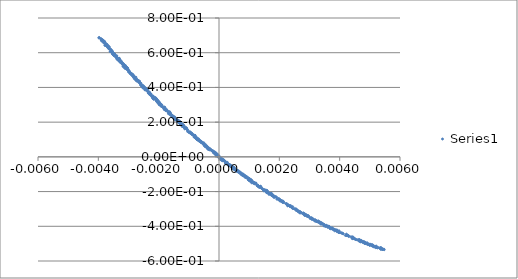
| Category | Series 0 |
|---|---|
| 0.0044368 | -0.464 |
| -0.0038042 | 0.659 |
| -0.0010522 | 0.158 |
| 0.00016845 | -0.019 |
| -0.0020957 | 0.334 |
| 0.00043947 | -0.056 |
| 0.00034397 | -0.047 |
| 0.001742 | -0.214 |
| -0.0013712 | 0.207 |
| 0.00099336 | -0.135 |
| 0.001655 | -0.216 |
| -0.002423 | 0.394 |
| 0.0010156 | -0.137 |
| -0.00056222 | 0.081 |
| -0.0010402 | 0.146 |
| 0.00020681 | -0.028 |
| 0.0010113 | -0.133 |
| -0.00313 | 0.514 |
| 0.002281 | -0.282 |
| -0.00067644 | 0.094 |
| 0.0052149 | -0.514 |
| 0.0021076 | -0.262 |
| -0.0015751 | 0.243 |
| -0.0030436 | 0.504 |
| 0.0029677 | -0.343 |
| 0.0050297 | -0.504 |
| 0.004289 | -0.453 |
| 0.0042575 | -0.454 |
| 0.0028009 | -0.328 |
| -0.00369 | 0.641 |
| -0.0012805 | 0.2 |
| 0.0015531 | -0.198 |
| -0.0015731 | 0.239 |
| 0.0023578 | -0.286 |
| 0.0006467 | -0.08 |
| 0.0017924 | -0.22 |
| 0.0022135 | -0.27 |
| 0.0036869 | -0.414 |
| 0.0019726 | -0.247 |
| -0.0036637 | 0.631 |
| -0.0019037 | 0.297 |
| 0.00087271 | -0.119 |
| -8.2279e-05 | 0.014 |
| 0.0049892 | -0.506 |
| -0.0022611 | 0.355 |
| -0.0028558 | 0.464 |
| -0.0018347 | 0.283 |
| 0.0013852 | -0.171 |
| -0.00028588 | 0.041 |
| 0.0024418 | -0.287 |
| 0.0036483 | -0.403 |
| -0.0011639 | 0.176 |
| -0.0028305 | 0.458 |
| 0.0050886 | -0.514 |
| -0.0025743 | 0.414 |
| 0.00478 | -0.488 |
| 0.0034057 | -0.384 |
| -0.0031957 | 0.535 |
| 0.0053647 | -0.529 |
| 0.001361 | -0.176 |
| -0.0010696 | 0.166 |
| 0.0028413 | -0.333 |
| -0.0029999 | 0.491 |
| -0.0037633 | 0.644 |
| 0.0022752 | -0.281 |
| 0.0034293 | -0.383 |
| 0.00056681 | -0.075 |
| 0.00033338 | -0.047 |
| 0.00021367 | -0.03 |
| -0.0011641 | 0.178 |
| -0.0034738 | 0.59 |
| 0.0039133 | -0.426 |
| -0.0013881 | 0.207 |
| 0.0027062 | -0.319 |
| 0.00093261 | -0.122 |
| 0.0048831 | -0.501 |
| 0.002695 | -0.322 |
| -0.00026158 | 0.041 |
| -0.0026672 | 0.439 |
| -0.00045644 | 0.062 |
| 0.0047831 | -0.495 |
| 0.00017566 | -0.025 |
| 0.0049978 | -0.503 |
| -0.0032841 | 0.546 |
| -0.0036489 | 0.622 |
| 0.0050599 | -0.511 |
| -0.0013146 | 0.195 |
| -0.0026327 | 0.431 |
| -0.00073186 | 0.101 |
| -0.003198 | 0.541 |
| -0.0016477 | 0.252 |
| -0.0016981 | 0.262 |
| -0.001611 | 0.247 |
| 0.0035788 | -0.399 |
| 0.003601 | -0.406 |
| 0.0020371 | -0.249 |
| 0.0054187 | -0.533 |
| -0.0035977 | 0.618 |
| 0.0051197 | -0.518 |
| -0.002965 | 0.493 |
| -0.0013525 | 0.203 |
| 0.0030805 | -0.361 |
| 4.7973e-05 | -0.007 |
| 0.0039146 | -0.423 |
| -0.00029224 | 0.046 |
| -0.0031313 | 0.524 |
| 0.0019871 | -0.243 |
| 0.0025629 | -0.309 |
| -0.0009814 | 0.142 |
| -0.0023002 | 0.367 |
| 0.00012115 | -0.018 |
| 0.00078824 | -0.108 |
| -0.0023041 | 0.371 |
| -0.0030424 | 0.513 |
| -0.0027268 | 0.444 |
| -0.001194 | 0.178 |
| -0.001812 | 0.272 |
| -0.0006367 | 0.09 |
| 0.00025769 | -0.033 |
| 0.00068978 | -0.092 |
| 0.0021221 | -0.255 |
| -0.00040166 | 0.062 |
| -0.0020535 | 0.327 |
| 0.00070861 | -0.094 |
| -0.0013437 | 0.206 |
| -0.0028089 | 0.464 |
| 0.00064698 | -0.087 |
| 0.0047986 | -0.493 |
| -0.0013027 | 0.203 |
| -0.00051239 | 0.074 |
| 0.0015804 | -0.193 |
| -0.0034625 | 0.583 |
| -0.00241 | 0.388 |
| 0.00069083 | -0.092 |
| 1.3595e-05 | -0.002 |
| 0.0014998 | -0.189 |
| 0.00038708 | -0.054 |
| 0.0053807 | -0.53 |
| 0.0017589 | -0.222 |
| -0.0013686 | 0.213 |
| 0.0029479 | -0.342 |
| 0.0031679 | -0.367 |
| -0.0019831 | 0.315 |
| 0.0047708 | -0.489 |
| -0.0022888 | 0.364 |
| -0.0023291 | 0.369 |
| 0.0010617 | -0.145 |
| 0.004632 | -0.477 |
| 0.00084273 | -0.113 |
| -0.0023525 | 0.374 |
| -0.00013238 | 0.027 |
| 0.0017718 | -0.222 |
| -0.0023196 | 0.365 |
| -0.0014854 | 0.224 |
| 0.0033862 | -0.387 |
| 0.0047202 | -0.486 |
| 0.0046787 | -0.486 |
| 0.001156 | -0.152 |
| -0.00044462 | 0.07 |
| -0.0007004 | 0.102 |
| 0.0039506 | -0.43 |
| 0.00098681 | -0.123 |
| -0.0016763 | 0.249 |
| 0.0010869 | -0.135 |
| 0.0046526 | -0.48 |
| 0.00096707 | -0.131 |
| -0.0027101 | 0.443 |
| -0.0034882 | 0.595 |
| 0.0029277 | -0.343 |
| 0.0037666 | -0.414 |
| 0.0050687 | -0.51 |
| 0.00031541 | -0.044 |
| -0.0001804 | 0.032 |
| 0.0031823 | -0.37 |
| -0.0011714 | 0.18 |
| -0.0032154 | 0.541 |
| -0.0024424 | 0.385 |
| 0.0030781 | -0.354 |
| 0.0016021 | -0.195 |
| 0.0041899 | -0.453 |
| -0.0016167 | 0.255 |
| -0.0012053 | 0.186 |
| 0.0012862 | -0.164 |
| -0.0025852 | 0.424 |
| -0.0030744 | 0.507 |
| -0.0029974 | 0.5 |
| 0.0012802 | -0.162 |
| -0.0029108 | 0.473 |
| 0.0011889 | -0.152 |
| -0.0024284 | 0.394 |
| 0.0049338 | -0.505 |
| 0.00021629 | -0.034 |
| -0.0033914 | 0.583 |
| -0.0023624 | 0.386 |
| -9.4201e-05 | 0.013 |
| -0.0022845 | 0.358 |
| -0.0016433 | 0.254 |
| -0.0023206 | 0.375 |
| -0.0037281 | 0.641 |
| 0.00071857 | -0.098 |
| 0.0018222 | -0.226 |
| -0.002511 | 0.398 |
| 0.001022 | -0.129 |
| -0.0019791 | 0.31 |
| 0.00048793 | -0.067 |
| 0.0042325 | -0.452 |
| -0.0019488 | 0.304 |
| 0.00095775 | -0.12 |
| -0.0036293 | 0.625 |
| 0.0037229 | -0.414 |
| -0.0037265 | 0.639 |
| -0.0012409 | 0.187 |
| -0.001936 | 0.306 |
| 7.6056e-05 | -0.01 |
| -0.0030553 | 0.511 |
| -0.0036482 | 0.635 |
| -0.0026336 | 0.436 |
| -0.00020601 | 0.035 |
| -0.0021879 | 0.35 |
| -0.00059174 | 0.088 |
| -0.0013626 | 0.211 |
| 0.0015008 | -0.194 |
| -0.0034875 | 0.595 |
| 0.0021271 | -0.26 |
| -0.0017426 | 0.273 |
| -0.00038814 | 0.05 |
| 0.0018908 | -0.23 |
| -0.0038445 | 0.671 |
| 0.0042881 | -0.454 |
| 0.0011552 | -0.147 |
| 0.0036303 | -0.403 |
| -0.0019771 | 0.305 |
| -0.00012061 | 0.017 |
| -0.0034132 | 0.575 |
| 0.00103 | -0.139 |
| -0.0031634 | 0.529 |
| 0.0013799 | -0.175 |
| 0.00021759 | -0.031 |
| 0.0031842 | -0.362 |
| -0.0012079 | 0.183 |
| -0.0023084 | 0.366 |
| -0.0037354 | 0.651 |
| 0.00021504 | -0.027 |
| -0.0022974 | 0.359 |
| 0.0050879 | -0.506 |
| 0.00076202 | -0.102 |
| -0.0020794 | 0.322 |
| -0.00091661 | 0.133 |
| 0.0016721 | -0.214 |
| 0.00098077 | -0.133 |
| -0.0038574 | 0.674 |
| 0.00011707 | -0.014 |
| -0.0024573 | 0.4 |
| -0.00037368 | 0.056 |
| 0.0026805 | -0.318 |
| 0.0019194 | -0.235 |
| -0.0014374 | 0.216 |
| -0.0038726 | 0.671 |
| -0.0032277 | 0.54 |
| -0.0001362 | 0.021 |
| -0.0020808 | 0.337 |
| -0.0025269 | 0.398 |
| 0.0017892 | -0.225 |
| 0.0032937 | -0.37 |
| -0.0035775 | 0.608 |
| 0.00034354 | -0.046 |
| -0.0019824 | 0.304 |
| 0.003379 | -0.379 |
| -0.0021555 | 0.339 |
| -0.0019731 | 0.299 |
| 0.0032292 | -0.372 |
| -0.001796 | 0.279 |
| -0.0032903 | 0.556 |
| -0.0028665 | 0.469 |
| 0.00089904 | -0.114 |
| 0.0033004 | -0.378 |
| 0.00044015 | -0.06 |
| -0.001558 | 0.231 |
| -0.0007859 | 0.116 |
| 0.0044807 | -0.472 |
| -0.0035351 | 0.609 |
| -0.0014645 | 0.229 |
| 0.0010168 | -0.136 |
| -0.0011374 | 0.162 |
| 0.0054743 | -0.535 |
| 0.002791 | -0.325 |
| -0.00062137 | 0.093 |
| -0.00059598 | 0.086 |
| -0.00089293 | 0.129 |
| 0.00051674 | -0.071 |
| -0.0007967 | 0.124 |
| -0.0035633 | 0.606 |
| -0.0033028 | 0.56 |
| -0.0035852 | 0.611 |
| 0.0037563 | -0.409 |
| -0.0025362 | 0.407 |
| -0.0007676 | 0.111 |
| 0.0019974 | -0.243 |
| -0.0014602 | 0.218 |
| 0.0015261 | -0.19 |
| 0.0053419 | -0.527 |
| 0.003548 | -0.393 |
| 0.00042687 | -0.051 |
| 0.0045085 | -0.472 |
| 0.0048569 | -0.493 |
| 0.0042174 | -0.451 |
| 0.00011936 | -0.022 |
| -0.0034748 | 0.595 |
| -0.00052499 | 0.076 |
| -0.0035361 | 0.599 |
| -0.0035986 | 0.618 |
| -0.0033846 | 0.569 |
| 0.00070467 | -0.088 |
| 0.00058944 | -0.076 |
| -0.0032264 | 0.538 |
| 0.00050638 | -0.07 |
| 0.00083561 | -0.109 |
| 0.0019781 | -0.244 |
| -0.0019881 | 0.317 |
| -0.0021561 | 0.34 |
| 0.0042233 | -0.445 |
| -0.001788 | 0.271 |
| 0.0039806 | -0.426 |
| 0.00091417 | -0.113 |
| 0.0038645 | -0.421 |
| -0.0035564 | 0.608 |
| 0.0025611 | -0.304 |
| -0.0020624 | 0.332 |
| 0.00027769 | -0.032 |
| 0.001122 | -0.144 |
| -0.0033771 | 0.572 |
| 0.0015944 | -0.206 |
| -0.002056 | 0.327 |
| -0.0019886 | 0.309 |
| -0.00070098 | 0.099 |
| 0.0013164 | -0.173 |
| -0.0039828 | 0.685 |
| 0.0025146 | -0.301 |
| -0.0034676 | 0.588 |
| 0.0020454 | -0.25 |
| 0.0029912 | -0.346 |
| 0.0026843 | -0.317 |
| 0.0040846 | -0.439 |
| -0.0017919 | 0.282 |
| 0.0014842 | -0.196 |
| -0.0033058 | 0.568 |
| 0.00055705 | -0.081 |
| 0.0024952 | -0.299 |
| 0.00442 | -0.47 |
| -0.00059035 | 0.088 |
| -0.0008289 | 0.115 |
| 0.0028194 | -0.327 |
| -0.0031458 | 0.531 |
| -0.0014247 | 0.212 |
| -0.0038414 | 0.669 |
| -0.00013526 | 0.015 |
| -0.00010968 | 0.019 |
| -0.0015964 | 0.239 |
| 0.00032726 | -0.049 |
| 0.0046973 | -0.482 |
| -0.0013331 | 0.199 |
| 0.00060985 | -0.081 |
| -0.0015164 | 0.226 |
| -0.0013297 | 0.204 |
| -0.0032291 | 0.548 |
| -0.0016389 | 0.26 |
| 0.0015515 | -0.201 |
| 0.0053717 | -0.525 |
| -0.0016112 | 0.247 |
| -0.0038243 | 0.669 |
| -0.0037918 | 0.663 |
| -0.0028487 | 0.472 |
| -0.0029415 | 0.483 |
| 0.0018195 | -0.227 |
| 0.0049954 | -0.506 |
| 0.0049937 | -0.509 |
| 0.00098164 | -0.123 |
| -0.00013961 | 0.024 |
| -0.0028071 | 0.45 |
| 0.0016068 | -0.202 |
| 0.00028573 | -0.04 |
| -0.0035807 | 0.618 |
| 0.0026732 | -0.314 |
| -0.0033046 | 0.558 |
| -0.0014206 | 0.215 |
| 0.0052329 | -0.52 |
| -0.0016278 | 0.253 |
| -0.0011926 | 0.178 |
| -0.00071848 | 0.106 |
| -0.0037129 | 0.644 |
| -0.003012 | 0.499 |
| -0.00081272 | 0.114 |
| 0.000803 | -0.101 |
| -0.00097671 | 0.141 |
| 0.0038258 | -0.418 |
| 0.0013525 | -0.174 |
| 0.0031276 | -0.359 |
| 2.3433e-06 | 0.005 |
| 0.00047557 | -0.069 |
| 0.0003835 | -0.052 |
| -0.0025328 | 0.412 |
| -0.00365 | 0.63 |
| -0.0019096 | 0.292 |
| -0.0022197 | 0.351 |
| -0.0038176 | 0.656 |
| -0.0023517 | 0.374 |
| -0.0020278 | 0.322 |
| 0.0047408 | -0.487 |
| -0.00089699 | 0.131 |
| 0.0050975 | -0.51 |
| 0.0030184 | -0.355 |
| -0.0024637 | 0.387 |
| -6.5429e-05 | 0.008 |
| -0.0035505 | 0.609 |
| -3.3758e-05 | 0 |
| 0.0027992 | -0.326 |
| -0.0013073 | 0.197 |
| -0.0021952 | 0.337 |
| -0.0031019 | 0.526 |
| -0.0032362 | 0.543 |
| -0.00080766 | 0.122 |
| -0.0019686 | 0.309 |
| -0.0033822 | 0.562 |
| -0.00031846 | 0.041 |
| 0.00013961 | -0.022 |
| 0.0026278 | -0.311 |
| -0.0034606 | 0.583 |
| -0.0011907 | 0.185 |
| 0.0023416 | -0.28 |
| -0.0031666 | 0.536 |
| -0.00054112 | 0.077 |
| 0.0032374 | -0.371 |
| 0.0049371 | -0.502 |
| -0.0028955 | 0.476 |
| -0.0011589 | 0.17 |
| 0.0050422 | -0.51 |
| -0.0031208 | 0.511 |
| 0.0053599 | -0.533 |
| 0.0049302 | -0.5 |
| 0.0035402 | -0.401 |
| -0.0036438 | 0.624 |
| -0.00018839 | 0.03 |
| -0.00079803 | 0.117 |
| 0.00090368 | -0.118 |
| -0.0013746 | 0.207 |
| -0.0037864 | 0.661 |
| -0.00072066 | 0.107 |
| 0.00047197 | -0.059 |
| 0.0011426 | -0.15 |
| 0.0002289 | -0.039 |
| -0.001984 | 0.303 |
| 0.0026647 | -0.317 |
| 0.0046558 | -0.477 |
| 0.0019185 | -0.244 |
| -0.00049221 | 0.066 |
| 0.0010742 | -0.137 |
| -0.0021613 | 0.338 |
| -0.0016485 | 0.247 |
| 0.0017641 | -0.224 |
| 0.0038061 | -0.419 |
| 5.8976e-05 | -0.016 |
| 0.001256 | -0.165 |
| 0.0047024 | -0.49 |
| 0.0004383 | -0.06 |
| 0.0017191 | -0.219 |
| 0.002131 | -0.257 |
| -0.003656 | 0.635 |
| -0.00037123 | 0.047 |
| -0.0026888 | 0.441 |
| 0.0019797 | -0.242 |
| -0.00075391 | 0.113 |
| 0.0028724 | -0.336 |
| 0.00234 | -0.283 |
| 0.0032187 | -0.37 |
| -0.0039653 | 0.685 |
| -0.00057047 | 0.081 |
| -0.003551 | 0.605 |
| 0.0017312 | -0.21 |
| -0.0016881 | 0.261 |
| 0.0027896 | -0.323 |
| -0.002723 | 0.447 |
| 0.002062 | -0.256 |
| 0.003983 | -0.436 |
| -0.0012294 | 0.183 |
| -0.0018835 | 0.294 |
| -0.0037854 | 0.66 |
| -0.0021589 | 0.338 |
| 0.0036418 | -0.399 |
| -0.0034516 | 0.59 |
| 0.0010889 | -0.15 |
| 0.0035794 | -0.397 |
| -0.0026739 | 0.438 |
| -0.0030452 | 0.513 |
| 0.00049312 | -0.06 |
| 0.0020989 | -0.254 |
| -0.0016559 | 0.253 |
| 0.0054655 | -0.532 |
| 0.0016924 | -0.213 |
| -0.0036622 | 0.632 |
| 0.0031951 | -0.365 |
| -0.00048045 | 0.069 |
| 0.0005498 | -0.076 |
| -0.0010384 | 0.155 |
| 0.00042017 | -0.059 |
| -0.0015149 | 0.23 |
| 0.00082504 | -0.104 |
| -0.00016846 | 0.025 |
| 0.0047491 | -0.489 |
| 0.00412 | -0.443 |
| -0.0012299 | 0.191 |
| -0.000755 | 0.105 |
| -0.0013127 | 0.197 |
| -0.0029459 | 0.486 |
| 0.00021692 | -0.03 |
| -0.00066955 | 0.094 |
| -0.0027976 | 0.461 |
| 0.0021165 | -0.261 |
| -0.0021435 | 0.343 |
| -0.0033845 | 0.575 |
| -0.0017251 | 0.269 |
| -0.0024598 | 0.396 |
| 0.0021504 | -0.263 |
| -0.0020477 | 0.317 |
| -0.0037077 | 0.641 |
| 0.0037967 | -0.417 |
| -0.001907 | 0.295 |
| -0.0021935 | 0.35 |
| 0.0044314 | -0.471 |
| -0.00049809 | 0.07 |
| 0.0012965 | -0.168 |
| -0.0022098 | 0.345 |
| -0.0018968 | 0.299 |
| -0.0008521 | 0.127 |
| 0.0051625 | -0.519 |
| -0.0014559 | 0.216 |
| -0.0025932 | 0.413 |
| -0.0026161 | 0.426 |
| -0.00046006 | 0.06 |
| -0.0036073 | 0.606 |
| 0.0013305 | -0.173 |
| -0.0019971 | 0.31 |
| 0.00048982 | -0.068 |
| -0.0014651 | 0.223 |
| 0.0033986 | -0.381 |
| -9.3987e-06 | -0.002 |
| 0.0033956 | -0.383 |
| 0.0037859 | -0.419 |
| 0.0010178 | -0.133 |
| -0.0012647 | 0.193 |
| 0.0026699 | -0.317 |
| -0.0030938 | 0.52 |
| 0.003641 | -0.403 |
| 0.0039611 | -0.435 |
| -0.0019913 | 0.31 |
| -0.0038623 | 0.664 |
| -0.00072825 | 0.1 |
| -0.0039725 | 0.688 |
| 0.0053591 | -0.523 |
| 0.0045239 | -0.476 |
| -0.003794 | 0.665 |
| -0.0034822 | 0.593 |
| -0.0031761 | 0.526 |
| 0.0044108 | -0.468 |
| -0.0030265 | 0.508 |
| 0.0016089 | -0.201 |
| 0.0051168 | -0.514 |
| -0.0028454 | 0.471 |
| 0.00424 | -0.453 |
| -0.00075714 | 0.104 |
| -0.00024484 | 0.037 |
| 0.0010048 | -0.131 |
| -0.0030548 | 0.508 |
| -0.0013545 | 0.203 |
| 0.0033812 | -0.386 |
| -0.0035236 | 0.592 |
| -0.0032985 | 0.56 |
| 0.0011694 | -0.15 |
| -0.0038631 | 0.672 |
| -0.0036719 | 0.632 |
| -0.0010755 | 0.16 |
| -0.0019042 | 0.29 |
| -0.00033845 | 0.052 |
| -0.0028195 | 0.463 |
| 0.0045509 | -0.477 |
| 0.0032067 | -0.369 |
| -0.00065162 | 0.093 |
| -0.0035738 | 0.616 |
| 0.0048476 | -0.498 |
| -0.00094484 | 0.135 |
| -0.0026604 | 0.429 |
| 0.00010899 | -0.017 |
| -0.0026002 | 0.417 |
| -0.0019649 | 0.305 |
| -0.0016435 | 0.252 |
| -0.0037059 | 0.64 |
| -0.0006985 | 0.097 |
| -0.0035066 | 0.599 |
| -0.0018072 | 0.277 |
| 0.0043754 | -0.46 |
| -0.0027279 | 0.442 |
| -0.0022529 | 0.362 |
| 0.00057788 | -0.082 |
| -0.0020878 | 0.326 |
| 0.00061776 | -0.081 |
| 0.0022408 | -0.269 |
| -0.0022999 | 0.37 |
| 0.0046723 | -0.479 |
| 0.0050781 | -0.512 |
| 0.0011293 | -0.15 |
| -0.00066083 | 0.092 |
| -0.0020415 | 0.328 |
| -0.00047852 | 0.072 |
| -0.0029878 | 0.488 |
| 0.00074701 | -0.103 |
| -0.001494 | 0.223 |
| -0.0038312 | 0.667 |
| -0.000614 | 0.087 |
| 0.0015642 | -0.2 |
| -0.0012255 | 0.184 |
| -0.0024917 | 0.401 |
| -0.0039121 | 0.679 |
| -0.0015066 | 0.234 |
| 0.0014345 | -0.182 |
| -0.0018712 | 0.287 |
| -0.0031664 | 0.532 |
| -0.0011825 | 0.179 |
| 0.0011252 | -0.145 |
| 0.0054273 | -0.532 |
| -0.0013567 | 0.203 |
| -0.0037533 | 0.648 |
| -0.003531 | 0.594 |
| -0.0020461 | 0.315 |
| -0.002531 | 0.409 |
| 0.0017922 | -0.224 |
| -0.0012488 | 0.186 |
| -0.00056228 | 0.082 |
| 0.002815 | -0.328 |
| 0.0030748 | -0.351 |
| -0.0036415 | 0.632 |
| 0.00085909 | -0.107 |
| -0.0017163 | 0.264 |
| 0.0018578 | -0.229 |
| -0.0019304 | 0.302 |
| 0.002273 | -0.279 |
| 0.00083111 | -0.111 |
| 0.0026742 | -0.317 |
| 0.00491 | -0.495 |
| 0.0051847 | -0.517 |
| 0.0011294 | -0.146 |
| -0.0015793 | 0.24 |
| -0.0018204 | 0.287 |
| 0.0050956 | -0.51 |
| 0.0025444 | -0.3 |
| 0.0020194 | -0.254 |
| 0.0040014 | -0.435 |
| -0.0035836 | 0.607 |
| 0.0027381 | -0.323 |
| -0.003684 | 0.63 |
| -0.00050558 | 0.081 |
| 0.001786 | -0.226 |
| -0.0020935 | 0.329 |
| -0.0033046 | 0.553 |
| -0.00010003 | 0.022 |
| 0.0016584 | -0.208 |
| -0.0013679 | 0.206 |
| -0.0012249 | 0.187 |
| -0.0013136 | 0.207 |
| -0.0012794 | 0.19 |
| 0.0034736 | -0.389 |
| -0.0011243 | 0.164 |
| -8.5151e-05 | 0.007 |
| 9.464e-05 | -0.013 |
| -0.00017491 | 0.026 |
| 0.0051686 | -0.514 |
| -0.00042134 | 0.058 |
| 0.0044826 | -0.469 |
| 0.0040407 | -0.437 |
| 0.0029616 | -0.339 |
| 0.00099356 | -0.126 |
| -0.0033286 | 0.564 |
| 2.7198e-05 | -0.01 |
| 0.0039398 | -0.428 |
| 0.0019625 | -0.244 |
| -0.0025452 | 0.404 |
| -0.0030387 | 0.514 |
| -0.00078665 | 0.11 |
| 0.0022792 | -0.28 |
| -0.0011412 | 0.167 |
| 0.0010661 | -0.14 |
| -0.0024895 | 0.403 |
| 0.00010898 | -0.013 |
| 0.0029064 | -0.335 |
| 0.0010421 | -0.136 |
| -0.0011808 | 0.181 |
| -0.0022295 | 0.353 |
| 0.00062454 | -0.086 |
| -0.0022309 | 0.347 |
| -0.0017534 | 0.265 |
| 0.00010855 | -0.016 |
| -0.00069014 | 0.103 |
| 0.0049873 | -0.508 |
| -0.00038862 | 0.051 |
| 9.9794e-05 | -0.018 |
| 0.0034725 | -0.389 |
| -0.0010749 | 0.16 |
| -0.0025005 | 0.408 |
| 0.00080388 | -0.1 |
| -0.0031059 | 0.519 |
| -0.0035355 | 0.605 |
| -0.00023115 | 0.035 |
| -0.0034635 | 0.593 |
| 0.0054005 | -0.53 |
| 0.0017418 | -0.211 |
| 0.0033501 | -0.377 |
| -0.0028973 | 0.478 |
| 0.0024199 | -0.293 |
| -0.0011038 | 0.17 |
| 0.0044347 | -0.461 |
| -0.0012863 | 0.188 |
| 0.004101 | -0.442 |
| 0.0036654 | -0.405 |
| 0.0003071 | -0.042 |
| 0.0017219 | -0.211 |
| -0.00066334 | 0.097 |
| -0.0012219 | 0.175 |
| -0.0038586 | 0.671 |
| 0.0034767 | -0.395 |
| -0.00347 | 0.582 |
| 0.0014713 | -0.189 |
| -0.0033262 | 0.555 |
| -0.00040492 | 0.06 |
| -0.00072307 | 0.1 |
| 0.0010546 | -0.138 |
| 2.1466e-05 | -0.007 |
| -0.0037064 | 0.647 |
| -0.00043556 | 0.063 |
| 0.00028899 | -0.045 |
| -0.0021023 | 0.335 |
| 0.0018278 | -0.234 |
| -0.0013858 | 0.206 |
| -0.002669 | 0.437 |
| 0.0054019 | -0.53 |
| 0.005198 | -0.523 |
| -0.0006112 | 0.091 |
| -0.00076535 | 0.108 |
| 0.00053931 | -0.068 |
| -0.0031906 | 0.534 |
| 0.001597 | -0.206 |
| -0.0034916 | 0.593 |
| 0.00039887 | -0.057 |
| -0.0027166 | 0.436 |
| -0.0027609 | 0.447 |
| 0.00048487 | -0.063 |
| 0.0036669 | -0.41 |
| -0.0016152 | 0.25 |
| 0.0036463 | -0.402 |
| -0.00037309 | 0.049 |
| 0.0029341 | -0.338 |
| -0.00043913 | 0.06 |
| -0.00094011 | 0.141 |
| -0.0018024 | 0.28 |
| 0.0047187 | -0.482 |
| -0.00011715 | 0.02 |
| -0.00080124 | 0.123 |
| -0.0014111 | 0.211 |
| -0.0025536 | 0.407 |
| 0.0034772 | -0.397 |
| -0.00039651 | 0.055 |
| -0.0032541 | 0.555 |
| -0.00035269 | 0.049 |
| 0.0038318 | -0.426 |
| -0.00063021 | 0.089 |
| -0.0031019 | 0.523 |
| -0.0009426 | 0.139 |
| 0.0024117 | -0.291 |
| 0.0018805 | -0.231 |
| 0.001415 | -0.182 |
| 0.00057034 | -0.08 |
| 0.0037283 | -0.409 |
| 0.0027984 | -0.33 |
| -0.001568 | 0.24 |
| 0.0046549 | -0.485 |
| -0.0003571 | 0.047 |
| 0.001345 | -0.173 |
| 0.00059029 | -0.08 |
| 0.0031326 | -0.362 |
| -0.0014475 | 0.221 |
| -0.0017971 | 0.286 |
| 0.0042262 | -0.452 |
| 0.0046849 | -0.484 |
| 0.0036799 | -0.407 |
| 0.0033658 | -0.385 |
| 0.0012846 | -0.167 |
| -0.0035144 | 0.59 |
| 0.0014517 | -0.187 |
| -0.0024244 | 0.395 |
| 0.0027939 | -0.326 |
| 0.0010655 | -0.134 |
| 0.0016553 | -0.208 |
| 0.002555 | -0.301 |
| 0.0046465 | -0.486 |
| 0.00022535 | -0.039 |
| 0.0029195 | -0.34 |
| -0.0011828 | 0.177 |
| -0.002275 | 0.363 |
| 0.00065195 | -0.088 |
| 0.0033129 | -0.374 |
| -0.0035451 | 0.6 |
| 0.0048208 | -0.489 |
| 0.00049539 | -0.066 |
| -0.0029251 | 0.48 |
| -0.0031092 | 0.51 |
| -0.002198 | 0.34 |
| -0.0033376 | 0.556 |
| -0.00089917 | 0.136 |
| 0.0032795 | -0.369 |
| 0.00021555 | -0.034 |
| 0.00047409 | -0.071 |
| 0.0030588 | -0.353 |
| -0.0021882 | 0.341 |
| -0.0024326 | 0.39 |
| 0.0012201 | -0.15 |
| 0.0040644 | -0.44 |
| 0.00013912 | -0.017 |
| 0.0013747 | -0.169 |
| -0.0033988 | 0.57 |
| -0.0034955 | 0.596 |
| -0.0028945 | 0.479 |
| 0.0018112 | -0.23 |
| -0.0028533 | 0.468 |
| -0.0017473 | 0.267 |
| 0.003519 | -0.398 |
| -0.0012896 | 0.201 |
| 0.0025973 | -0.307 |
| -0.0011063 | 0.163 |
| -0.0021216 | 0.34 |
| 0.004628 | -0.48 |
| 0.0038715 | -0.423 |
| -0.0028753 | 0.474 |
| -0.0021724 | 0.334 |
| -0.0039011 | 0.68 |
| -0.0025754 | 0.414 |
| -0.003665 | 0.629 |
| -0.0018301 | 0.278 |
| 0.0022902 | -0.275 |
| -0.0026796 | 0.437 |
| 0.0028386 | -0.338 |
| 0.00010023 | -0.021 |
| -0.0036372 | 0.624 |
| -0.0014991 | 0.227 |
| -0.00088859 | 0.13 |
| -0.0012434 | 0.191 |
| 0.0032273 | -0.369 |
| -0.0030624 | 0.506 |
| 0.0031147 | -0.359 |
| 0.00034872 | -0.045 |
| -0.00096383 | 0.145 |
| -0.0013501 | 0.202 |
| -0.0021228 | 0.336 |
| 0.0030397 | -0.352 |
| -0.0020728 | 0.331 |
| -0.00059417 | 0.083 |
| -0.0020095 | 0.32 |
| -0.0014637 | 0.222 |
| 0.00058508 | -0.076 |
| 0.00054253 | -0.076 |
| 0.0049809 | -0.506 |
| -0.0023888 | 0.381 |
| -0.0037456 | 0.651 |
| -0.0021081 | 0.341 |
| -0.0027944 | 0.46 |
| -0.0028732 | 0.476 |
| -0.0035131 | 0.596 |
| -0.0032988 | 0.555 |
| -0.0038965 | 0.672 |
| -0.0027212 | 0.442 |
| 0.0015856 | -0.206 |
| 0.0052279 | -0.521 |
| 0.00014491 | -0.019 |
| -0.0015309 | 0.236 |
| 0.00085251 | -0.11 |
| 0.00079957 | -0.105 |
| 0.0026848 | -0.324 |
| -0.0027576 | 0.442 |
| -0.0024743 | 0.395 |
| -4.0201e-05 | 0.013 |
| -0.00017257 | 0.029 |
| 0.0020421 | -0.254 |
| 0.0050349 | -0.506 |
| 0.00010659 | -0.02 |
| -0.0037706 | 0.642 |
| -0.002753 | 0.459 |
| 0.00060638 | -0.083 |
| -0.0026135 | 0.423 |
| -0.0035082 | 0.598 |
| 0.0054165 | -0.533 |
| -0.0036463 | 0.624 |
| -0.00055555 | 0.084 |
| -0.0027295 | 0.441 |
| 0.003236 | -0.372 |
| -0.002341 | 0.367 |
| 0.0034156 | -0.386 |
| 0.0039814 | -0.435 |
| -0.0025555 | 0.406 |
| -7.3782e-05 | 0.018 |
| 0.0025979 | -0.311 |
| 0.0028618 | -0.336 |
| 0.0028703 | -0.331 |
| 0.0033429 | -0.376 |
| 0.0026063 | -0.31 |
| 0.0021127 | -0.258 |
| -0.0035028 | 0.587 |
| 0.0027158 | -0.321 |
| -0.00018641 | 0.027 |
| -0.00035793 | 0.043 |
| 0.004589 | -0.478 |
| -0.0029497 | 0.48 |
| -0.0028525 | 0.465 |
| -0.0020883 | 0.331 |
| 0.0011878 | -0.155 |
| -0.00013314 | 0.021 |
| -0.0016261 | 0.244 |
| 0.00476 | -0.489 |
| 0.00075052 | -0.094 |
| 0.0039046 | -0.43 |
| 0.0023897 | -0.288 |
| 0.0012742 | -0.167 |
| -0.0023325 | 0.371 |
| -0.00197 | 0.303 |
| 0.0053606 | -0.525 |
| -0.0034801 | 0.589 |
| 0.0037568 | -0.413 |
| -0.00043567 | 0.058 |
| 0.0035094 | -0.399 |
| 1.9729e-05 | 0.001 |
| 0.0010472 | -0.129 |
| 0.0048323 | -0.498 |
| -0.0031803 | 0.521 |
| 0.00070598 | -0.095 |
| 0.0023422 | -0.284 |
| 0.0016039 | -0.201 |
| -0.00045503 | 0.061 |
| -0.0033672 | 0.569 |
| -0.00018662 | 0.024 |
| -0.0037269 | 0.644 |
| 0.0031721 | -0.366 |
| 0.0023748 | -0.281 |
| 0.0032995 | -0.372 |
| 0.00078144 | -0.105 |
| -0.0038376 | 0.667 |
| 0.00064877 | -0.087 |
| 0.0022464 | -0.271 |
| -0.0036877 | 0.63 |
| -0.0027819 | 0.452 |
| -0.0037794 | 0.643 |
| 0.0043049 | -0.459 |
| 0.00026628 | -0.041 |
| 0.0032873 | -0.376 |
| -0.0020243 | 0.311 |
| 0.00077914 | -0.103 |
| 0.00035922 | -0.05 |
| -0.003307 | 0.567 |
| 0.00080342 | -0.103 |
| 0.005254 | -0.524 |
| -0.0021627 | 0.332 |
| 0.0053756 | -0.525 |
| 0.0048435 | -0.5 |
| -0.00067489 | 0.103 |
| -0.0012117 | 0.176 |
| -0.00089016 | 0.133 |
| 0.0039024 | -0.421 |
| 8.0315e-05 | -0.01 |
| 0.0012243 | -0.153 |
| 0.0020816 | -0.254 |
| 0.0015946 | -0.207 |
| -0.0015771 | 0.241 |
| -0.0034403 | 0.58 |
| 0.002906 | -0.339 |
| -0.00099034 | 0.14 |
| 0.0052713 | -0.522 |
| 0.0026343 | -0.317 |
| -0.00084554 | 0.122 |
| 0.0017592 | -0.222 |
| -8.2011e-05 | 0.016 |
| -0.00048094 | 0.07 |
| -0.0001943 | 0.032 |
| 0.00025175 | -0.036 |
| 0.0030397 | -0.353 |
| -0.0015376 | 0.233 |
| 0.0046536 | -0.484 |
| 0.0013221 | -0.173 |
| 0.0024516 | -0.299 |
| -0.0012957 | 0.201 |
| -0.00034861 | 0.049 |
| 0.0042658 | -0.451 |
| -0.0038968 | 0.669 |
| 0.00037549 | -0.046 |
| -0.00080358 | 0.124 |
| 0.0053193 | -0.525 |
| -0.0019114 | 0.292 |